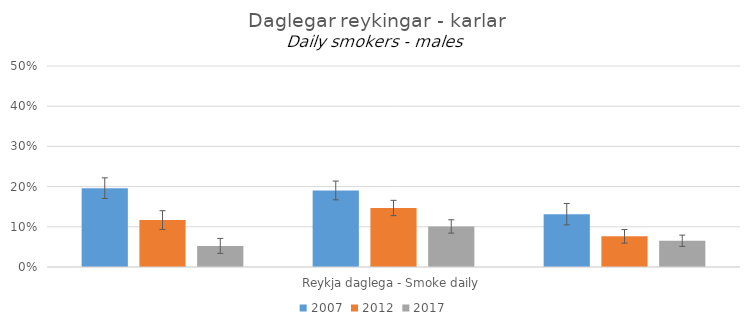
| Category | 2007 | 2012 | 2017 |
|---|---|---|---|
| 0 | 0.196 | 0.117 | 0.053 |
| 1 | 0.19 | 0.147 | 0.101 |
| 2 | 0.131 | 0.076 | 0.065 |